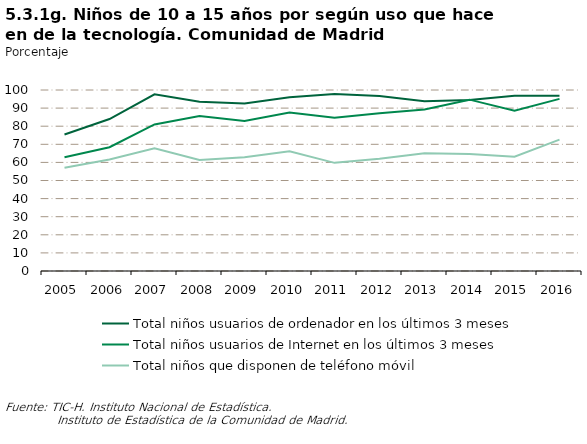
| Category | Total niños usuarios de ordenador en los últimos 3 meses | Total niños usuarios de Internet en los últimos 3 meses | Total niños que disponen de teléfono móvil |
|---|---|---|---|
| 2005.0 | 75.399 | 62.846 | 57.019 |
| 2006.0 | 83.968 | 68.395 | 61.641 |
| 2007.0 | 97.595 | 80.998 | 67.8 |
| 2008.0 | 93.52 | 85.587 | 61.378 |
| 2009.0 | 92.6 | 82.9 | 62.8 |
| 2010.0 | 96 | 87.5 | 66.2 |
| 2011.0 | 97.798 | 84.715 | 59.747 |
| 2012.0 | 96.698 | 87.188 | 62.003 |
| 2013.0 | 93.827 | 89.257 | 65.089 |
| 2014.0 | 94.54 | 94.667 | 64.653 |
| 2015.0 | 96.817 | 88.561 | 63.094 |
| 2016.0 | 96.852 | 95.101 | 72.58 |